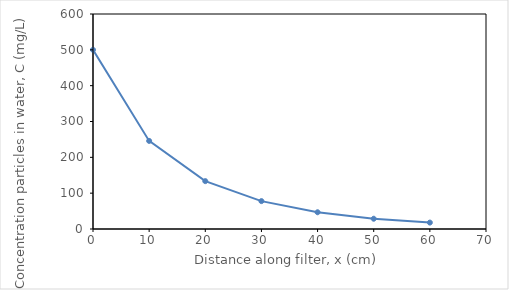
| Category | Series 0 |
|---|---|
| 0.0 | 500 |
| 10.0 | 245.822 |
| 20.0 | 133.568 |
| 30.0 | 77.836 |
| 40.0 | 46.74 |
| 50.0 | 28.634 |
| 60.0 | 17.897 |